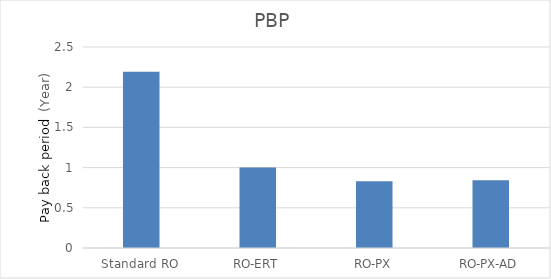
| Category | PBP |
|---|---|
| Standard RO | 2.193 |
| RO-ERT | 1 |
| RO-PX | 0.83 |
| RO-PX-AD | 0.843 |